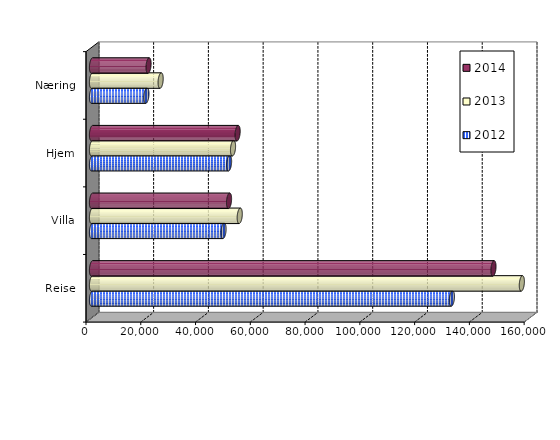
| Category | 2012 | 2013 | 2014 |
|---|---|---|---|
| Reise | 131420 | 156964 | 146608 |
| Villa | 48038 | 53950 | 50045 |
| Hjem | 50056 | 51497 | 53178 |
| Næring | 19866 | 25068 | 20657 |